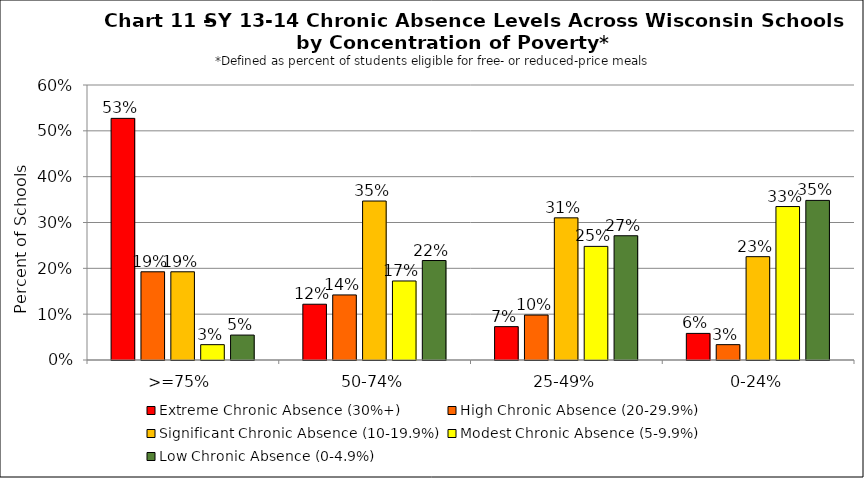
| Category | Extreme Chronic Absence (30%+) | High Chronic Absence (20-29.9%) | Significant Chronic Absence (10-19.9%) | Modest Chronic Absence (5-9.9%) | Low Chronic Absence (0-4.9%) |
|---|---|---|---|---|---|
| 0 | 0.527 | 0.192 | 0.192 | 0.033 | 0.054 |
| 1 | 0.122 | 0.142 | 0.347 | 0.172 | 0.217 |
| 2 | 0.073 | 0.098 | 0.31 | 0.248 | 0.271 |
| 3 | 0.058 | 0.033 | 0.225 | 0.335 | 0.348 |